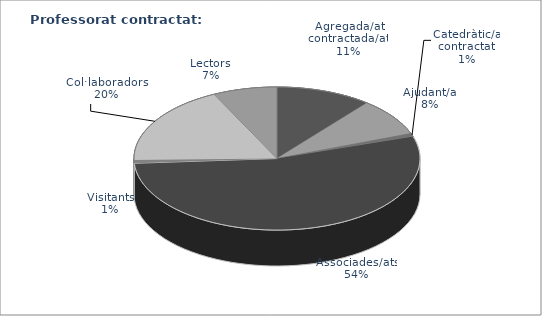
| Category | Agregada/at contractada/at Ajudant/a Catedràtic/a contractat Associades/ats Visitants Col·laboradores/ors  Lectors |
|---|---|
| Agregada/at contractada/at | 160 |
| Ajudant/a | 125 |
| Catedràtic/a contractat | 11 |
| Associades/ats | 796 |
| Visitants | 11 |
| Col·laboradores/ors  | 267 |
| Lectors | 107 |